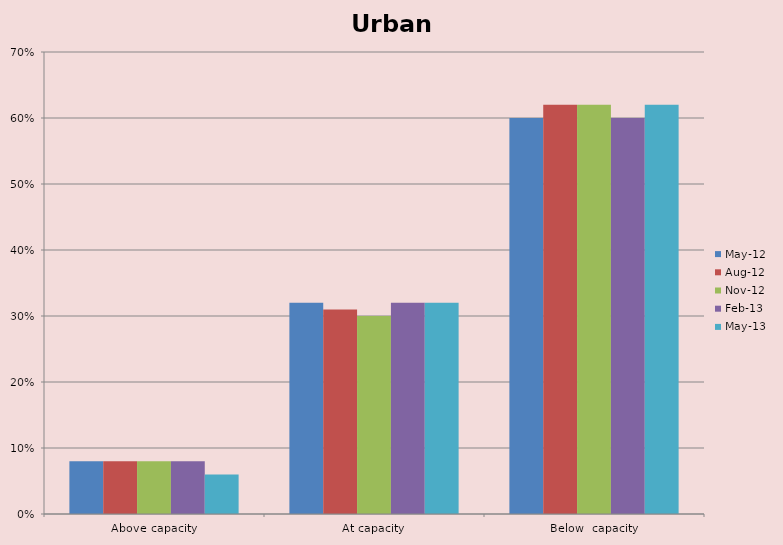
| Category | May-12 | Aug-12 | Nov-12 | Feb-13 | May-13 |
|---|---|---|---|---|---|
| Above capacity | 0.08 | 0.08 | 0.08 | 0.08 | 0.06 |
| At capacity | 0.32 | 0.31 | 0.3 | 0.32 | 0.32 |
| Below  capacity | 0.6 | 0.62 | 0.62 | 0.6 | 0.62 |